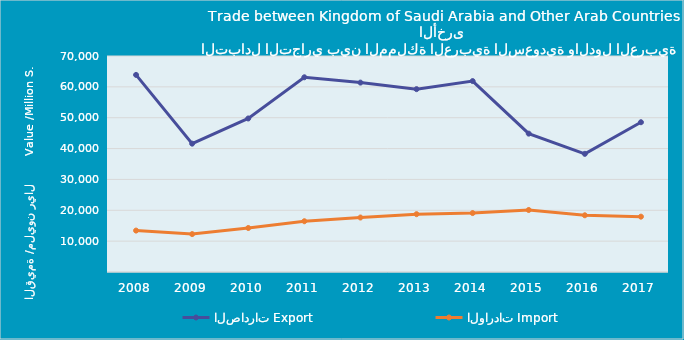
| Category | الصادرات | الواردات |
|---|---|---|
| 2008.0 | 63879600842 | 13425180399 |
| 2009.0 | 41590220535 | 12285294800 |
| 2010.0 | 49753367748 | 14260554513 |
| 2011.0 | 63103139537 | 16451621185 |
| 2012.0 | 61379311755 | 17655230273 |
| 2013.0 | 59256557166 | 18737009100 |
| 2014.0 | 61874003822 | 19097745011 |
| 2015.0 | 44836217586 | 20094584079 |
| 2016.0 | 38290870481 | 18382534453 |
| 2017.0 | 48537273881 | 17933947092 |